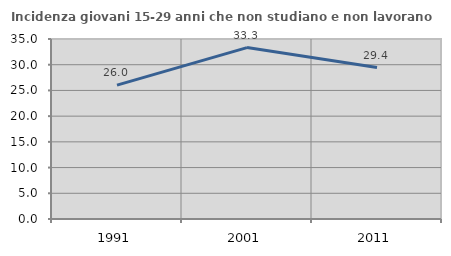
| Category | Incidenza giovani 15-29 anni che non studiano e non lavorano  |
|---|---|
| 1991.0 | 26.036 |
| 2001.0 | 33.333 |
| 2011.0 | 29.448 |